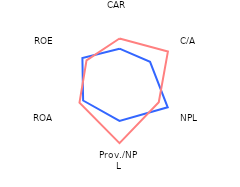
| Category | Serbia | Region |
|---|---|---|
| CAR | 2.2 | 2.929 |
| C/A | 2.52 | 3.992 |
| NPL | 3.976 | 3.24 |
| Prov./NPL | 2.96 | 4.547 |
| ROA | 3 | 3.3 |
| ROE | 3.06 | 2.72 |